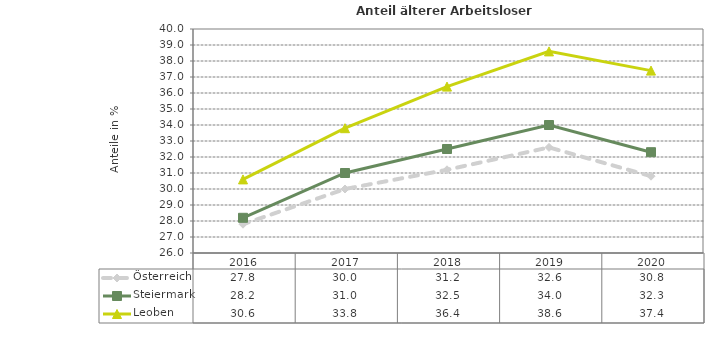
| Category | Österreich | Steiermark | Leoben |
|---|---|---|---|
| 2020.0 | 30.8 | 32.3 | 37.4 |
| 2019.0 | 32.6 | 34 | 38.6 |
| 2018.0 | 31.2 | 32.5 | 36.4 |
| 2017.0 | 30 | 31 | 33.8 |
| 2016.0 | 27.8 | 28.2 | 30.6 |